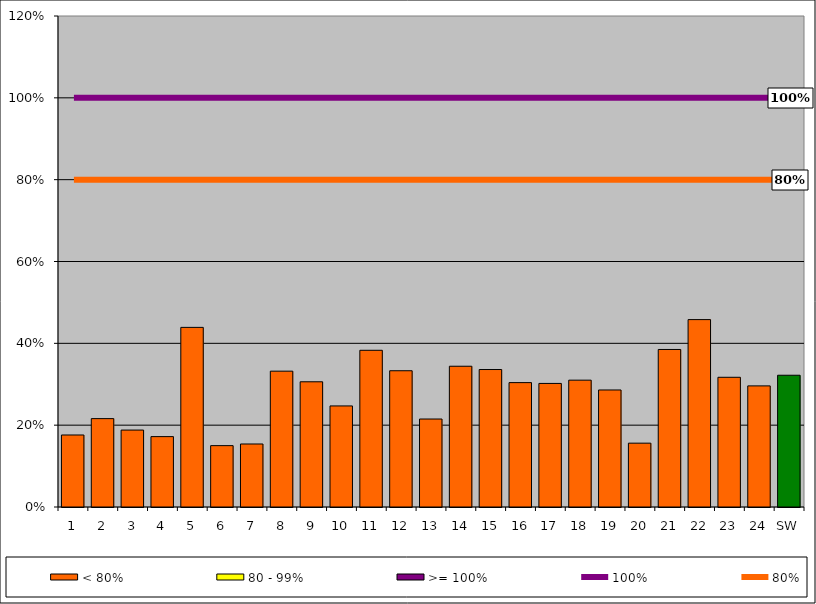
| Category | < 80% | 80 - 99% | >= 100% |
|---|---|---|---|
| 1 | 0.176 | 0 | 0 |
| 2 | 0.216 | 0 | 0 |
| 3 | 0.188 | 0 | 0 |
| 4 | 0.172 | 0 | 0 |
| 5 | 0.439 | 0 | 0 |
| 6 | 0.15 | 0 | 0 |
| 7 | 0.154 | 0 | 0 |
| 8 | 0.332 | 0 | 0 |
| 9 | 0.306 | 0 | 0 |
| 10 | 0.247 | 0 | 0 |
| 11 | 0.383 | 0 | 0 |
| 12 | 0.333 | 0 | 0 |
| 13 | 0.215 | 0 | 0 |
| 14 | 0.344 | 0 | 0 |
| 15 | 0.336 | 0 | 0 |
| 16 | 0.304 | 0 | 0 |
| 17 | 0.302 | 0 | 0 |
| 18 | 0.31 | 0 | 0 |
| 19 | 0.286 | 0 | 0 |
| 20 | 0.156 | 0 | 0 |
| 21 | 0.385 | 0 | 0 |
| 22 | 0.458 | 0 | 0 |
| 23 | 0.317 | 0 | 0 |
| 24 | 0.296 | 0 | 0 |
| SW | 0.322 | 0 | 0 |